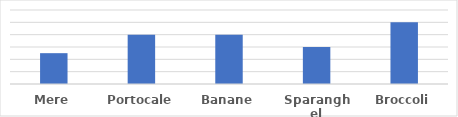
| Category | Cantitate |
|---|---|
| Mere | 500 |
| Portocale | 800 |
| Banane | 800 |
| Sparanghel | 600 |
| Broccoli | 1000 |